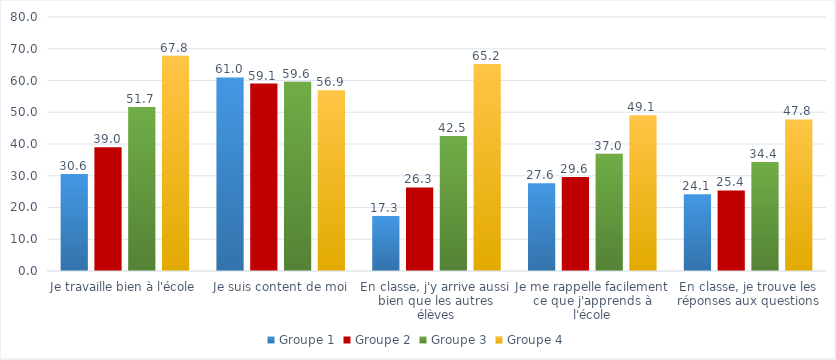
| Category | Groupe 1 | Groupe 2 | Groupe 3 | Groupe 4 |
|---|---|---|---|---|
| Je travaille bien à l'école | 30.58 | 38.99 | 51.68 | 67.76 |
| Je suis content de moi | 60.98 | 59.05 | 59.57 | 56.89 |
| En classe, j'y arrive aussi bien que les autres élèves | 17.34 | 26.31 | 42.49 | 65.22 |
| Je me rappelle facilement ce que j'apprends à l'école | 27.62 | 29.59 | 36.95 | 49.08 |
| En classe, je trouve les réponses aux questions | 24.14 | 25.37 | 34.36 | 47.75 |